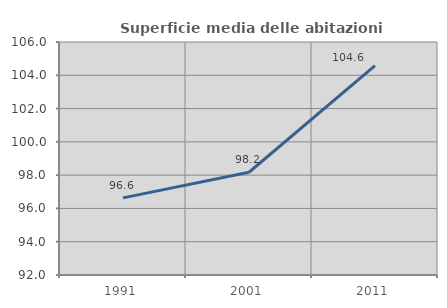
| Category | Superficie media delle abitazioni occupate |
|---|---|
| 1991.0 | 96.633 |
| 2001.0 | 98.174 |
| 2011.0 | 104.576 |